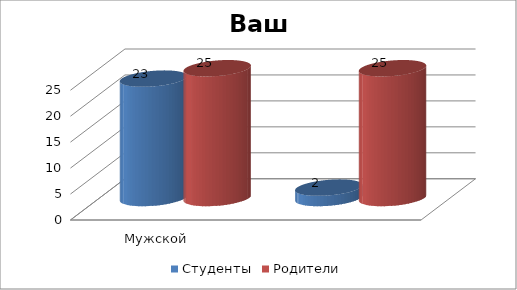
| Category | Студенты | Родители |
|---|---|---|
| Мужской | 23 | 25 |